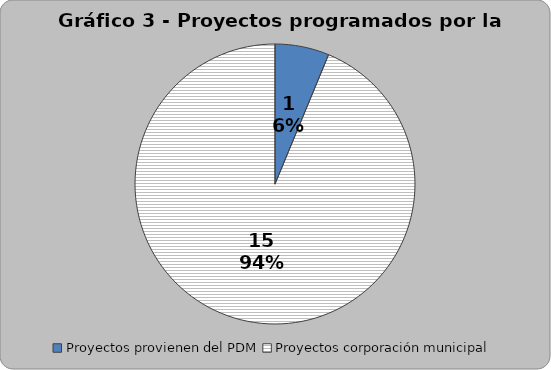
| Category | Series 0 |
|---|---|
| Proyectos provienen del PDM | 1 |
| Proyectos corporación municipal | 15 |